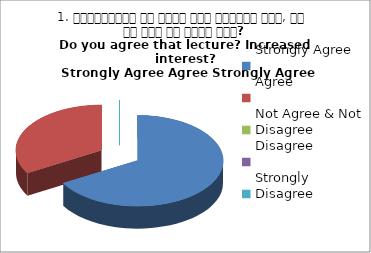
| Category | 1. व्याख्यान से रूचि में वृद्धि हुई, आप इस बात से सहमत हैं?
Do you agree that lecture? Increased interest?
 Strongly Agree Agree Strongly Agree |
|---|---|
| Strongly Agree | 2 |
| Agree | 1 |
| Not Agree & Not Disagree | 0 |
| Disagree | 0 |
| Strongly Disagree | 0 |